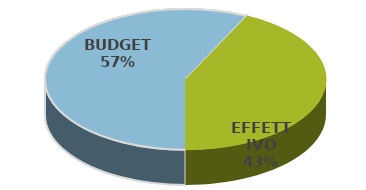
| Category | Series 0 |
|---|---|
| BUDGET | 1085000 |
| EFFETTIVO | 812000 |